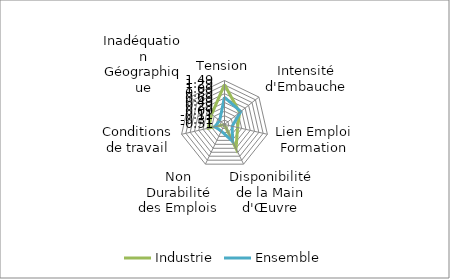
| Category | Industrie | Ensemble |
|---|---|---|
| Tension | 1.307 | 0.728 |
| Intensité d'Embauche | 0.369 | 0.434 |
| Lien Emploi Formation | 0.099 | -0.153 |
| Disponibilité de la Main d'Œuvre | 0.701 | 0.338 |
| Non Durabilité des Emplois | -0.515 | -0.177 |
| Conditions de travail | 0.234 | -0.058 |
| Inadéquation Géographique | 0.236 | -0.228 |